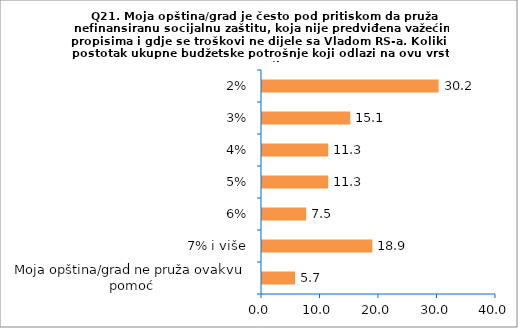
| Category | Series 0 |
|---|---|
| Moja opština/grad ne pruža ovakvu pomoć | 5.66 |
| 7% i više | 18.868 |
| 6% | 7.547 |
| 5% | 11.321 |
| 4% | 11.321 |
| 3% | 15.094 |
| 2% | 30.189 |